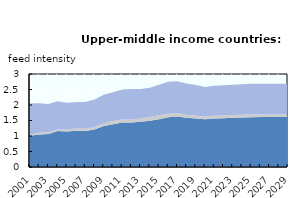
| Category | High protein feed | Medium protein feed | Low protein feed |
|---|---|---|---|
| 2001.0 | 1.008 | 0.038 | 1.001 |
| 2002.0 | 1.046 | 0.055 | 0.956 |
| 2003.0 | 1.062 | 0.056 | 0.917 |
| 2004.0 | 1.158 | 0.056 | 0.911 |
| 2005.0 | 1.147 | 0.06 | 0.866 |
| 2006.0 | 1.169 | 0.071 | 0.853 |
| 2007.0 | 1.164 | 0.07 | 0.861 |
| 2008.0 | 1.207 | 0.08 | 0.889 |
| 2009.0 | 1.322 | 0.093 | 0.918 |
| 2010.0 | 1.381 | 0.101 | 0.933 |
| 2011.0 | 1.434 | 0.095 | 0.969 |
| 2012.0 | 1.435 | 0.096 | 0.984 |
| 2013.0 | 1.457 | 0.111 | 0.949 |
| 2014.0 | 1.495 | 0.118 | 0.941 |
| 2015.0 | 1.543 | 0.126 | 0.988 |
| 2016.0 | 1.604 | 0.115 | 1.028 |
| 2017.0 | 1.633 | 0.103 | 1.029 |
| 2018.0 | 1.588 | 0.094 | 1.011 |
| 2019.0 | 1.562 | 0.092 | 0.989 |
| 2020.0 | 1.537 | 0.091 | 0.954 |
| 2021.0 | 1.565 | 0.09 | 0.962 |
| 2022.0 | 1.575 | 0.09 | 0.97 |
| 2023.0 | 1.585 | 0.089 | 0.979 |
| 2024.0 | 1.595 | 0.089 | 0.985 |
| 2025.0 | 1.606 | 0.088 | 0.992 |
| 2026.0 | 1.609 | 0.087 | 0.991 |
| 2027.0 | 1.611 | 0.086 | 0.991 |
| 2028.0 | 1.611 | 0.085 | 0.99 |
| 2029.0 | 1.61 | 0.083 | 0.988 |